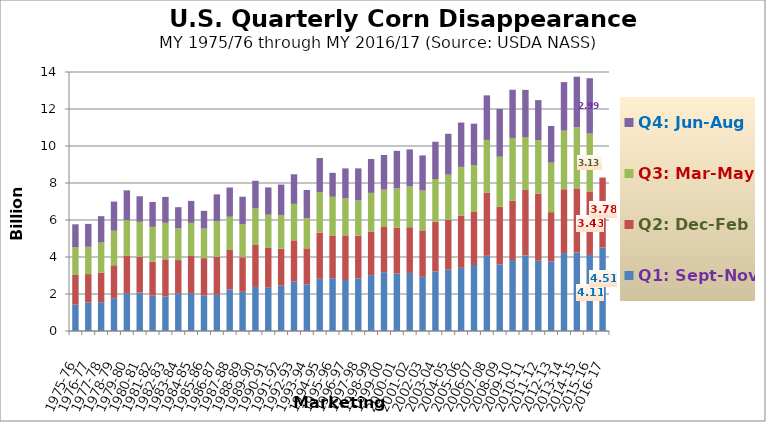
| Category | Q1: Sept-Nov | Q2: Dec-Feb | Q3: Mar-May | Q4: Jun-Aug |
|---|---|---|---|---|
| 1975-76 | 1.424 | 1.602 | 1.505 | 1.236 |
| 1976-77 | 1.536 | 1.539 | 1.479 | 1.235 |
| 1977-78 | 1.555 | 1.606 | 1.621 | 1.426 |
| 1978-79 | 1.776 | 1.777 | 1.864 | 1.578 |
| 1979-80 | 2.044 | 2.037 | 1.913 | 1.61 |
| 1980-81 | 2.078 | 1.934 | 1.889 | 1.382 |
| 1981-82 | 1.91 | 1.835 | 1.886 | 1.344 |
| 1982-83 | 1.866 | 2.007 | 1.975 | 1.401 |
| 1983-84 | 2.046 | 1.787 | 1.72 | 1.139 |
| 1984-85 | 2.048 | 2.008 | 1.789 | 1.187 |
| 1985-86 | 1.91 | 2.029 | 1.599 | 0.956 |
| 1986-87 | 1.96 | 2.057 | 1.916 | 1.451 |
| 1987-88 | 2.243 | 2.136 | 1.798 | 1.581 |
| 1988-89 | 2.117 | 1.868 | 1.786 | 1.489 |
| 1989-90 | 2.381 | 2.27 | 1.97 | 1.499 |
| 1990-91 | 2.339 | 2.152 | 1.798 | 1.472 |
| 1991-92 | 2.455 | 1.991 | 1.828 | 1.642 |
| 1992-93 | 2.672 | 2.229 | 1.971 | 1.599 |
| 1993-94 | 2.519 | 1.949 | 1.642 | 1.511 |
| 1994-95 | 2.822 | 2.493 | 2.18 | 1.858 |
| 1995-96 | 2.856 | 2.311 | 2.087 | 1.295 |
| 1996-97 | 2.759 | 2.411 | 2.001 | 1.617 |
| 1997-98 | 2.845 | 2.308 | 1.904 | 1.734 |
| 1998-99 | 3.019 | 2.359 | 2.089 | 1.831 |
| 1999-00 | 3.182 | 2.441 | 2.021 | 1.871 |
| 2000-01 | 3.104 | 2.488 | 2.122 | 2.026 |
| 2001-02 | 3.139 | 2.471 | 2.203 | 2.002 |
| 2002-03 | 2.929 | 2.51 | 2.152 | 1.9 |
| 2003-04 | 3.223 | 2.686 | 2.306 | 2.015 |
| 2004-05 | 3.313 | 2.698 | 2.44 | 2.21 |
| 2005-06 | 3.413 | 2.829 | 2.63 | 2.396 |
| 2006-07 | 3.567 | 2.866 | 2.54 | 2.233 |
| 2007-08 | 4.066 | 3.422 | 2.84 | 2.409 |
| 2008-09 | 3.598 | 3.122 | 2.698 | 2.59 |
| 2009-10 | 3.839 | 3.21 | 3.387 | 2.605 |
| 2010-11 | 4.082 | 3.542 | 2.863 | 2.546 |
| 2011-12 | 3.799 | 3.627 | 2.886 | 2.17 |
| 2012-13 | 3.746 | 2.678 | 2.674 | 1.985 |
| 2013-14 | 4.212 | 3.451 | 3.165 | 2.626 |
| 2014-15 | 4.241 | 3.468 | 3.307 | 2.733 |
| 2015-16 | 4.111 | 3.431 | 3.131 | 2.991 |
| 2016-17 | 4.514 | 3.781 | 0 | 0 |